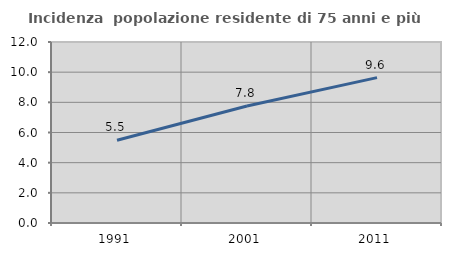
| Category | Incidenza  popolazione residente di 75 anni e più |
|---|---|
| 1991.0 | 5.487 |
| 2001.0 | 7.76 |
| 2011.0 | 9.639 |